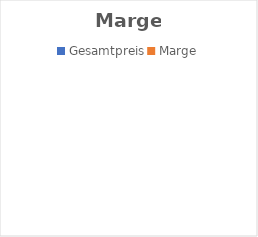
| Category | Series 0 |
|---|---|
| Gesamtpreis | 0 |
| Marge | 0 |